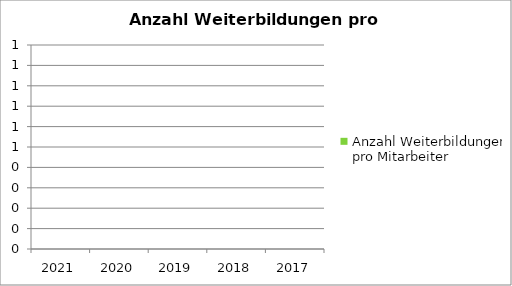
| Category | Anzahl Weiterbildungen pro Mitarbeiter |
|---|---|
| 2021.0 | 0 |
| 2020.0 | 0 |
| 2019.0 | 0 |
| 2018.0 | 0 |
| 2017.0 | 0 |